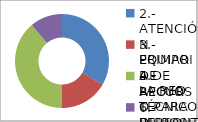
| Category | Series 0 |
|---|---|
| 2.- ATENCIÓN PRIMARIA DE
LA RED | 6 |
| 3.- EQUIPO DE APOYO TÉCNICO PERSONAL Y FAMILIAR PARA LA INCLUSIÓN SOCIAL | 3 |
| 4.- RECURSO PARA EL EMPLEO | 7 |
| 6.- DISPOSITIVO PARA LA ATENCIÓN  DE NECESIDADES BÁSICAS | 2 |